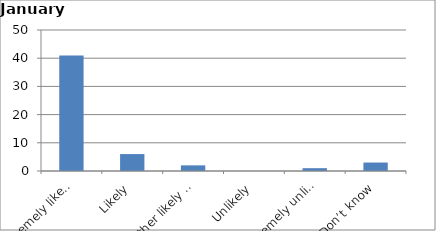
| Category | Series 0 |
|---|---|
| Extremely likely | 41 |
| Likely | 6 |
| Neither likely nor unlikely | 2 |
| Unlikely | 0 |
| Extremely unlikely | 1 |
| Don’t know | 3 |